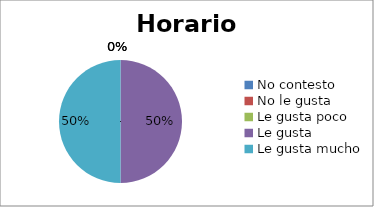
| Category | Series 0 |
|---|---|
| No contesto | 0 |
| No le gusta | 0 |
| Le gusta poco | 0 |
| Le gusta | 1 |
| Le gusta mucho | 1 |